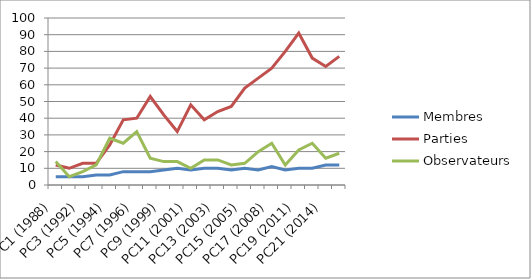
| Category | Membres | Parties | Observateurs |
|---|---|---|---|
| PC1 (1988) | 5 | 12 | 14 |
| PC2 (1991) | 5 | 10 | 5 |
| PC3 (1992) | 5 | 13 | 8 |
| PC4 (1993) | 6 | 13 | 12 |
| PC5 (1994) | 6 | 24 | 28 |
| PC6 (1995) | 8 | 39 | 25 |
| PC7 (1996) | 8 | 40 | 32 |
| PC8 (1997) | 8 | 53 | 16 |
| PC9 (1999) | 9 | 42 | 14 |
| PC10 (2000) | 10 | 32 | 14 |
| PC11 (2001) | 9 | 48 | 10 |
| PC12 (2002) | 10 | 39 | 15 |
| PC13 (2003) | 10 | 44 | 15 |
| PC14 (2004) | 9 | 47 | 12 |
| PC15 (2005) | 10 | 58 | 13 |
| PC16 (2006) | 9 | 64 | 20 |
| PC17 (2008) | 11 | 70 | 25 |
| PC18 (2009) | 9 | 80 | 12 |
| PC19 (2011) | 10 | 91 | 21 |
| PC20 (2012) | 10 | 76 | 25 |
| PC21 (2014) | 12 | 71 | 16 |
| PC22 (2015) | 12 | 77 | 19 |